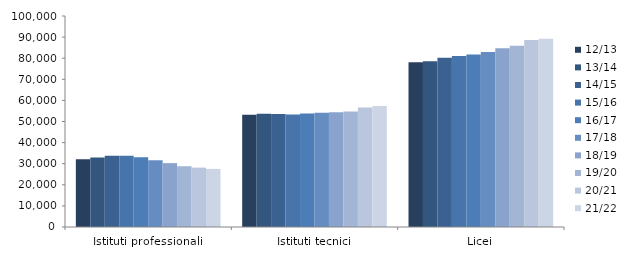
| Category | 12/13 | 13/14 | 14/15 | 15/16 | 16/17 | 17/18 | 18/19 | 19/20 | 20/21 | 21/22 |
|---|---|---|---|---|---|---|---|---|---|---|
| Istituti professionali | 32072 | 32940 | 33749 | 33805 | 33079 | 31680 | 30276 | 28805 | 28141 | 27539 |
| Istituti tecnici | 53173 | 53716 | 53502 | 53327 | 53766 | 54121 | 54432 | 54729 | 56653 | 57341 |
| Licei | 78064 | 78552 | 80234 | 81073 | 81747 | 82932 | 84694 | 85850 | 88614 | 89245 |